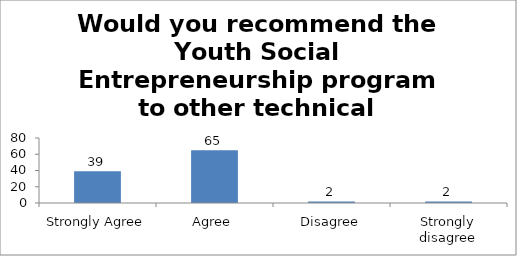
| Category | Would you recommend the Youth Social Entrepreneurship program to other technical institutions? |
|---|---|
| Strongly Agree | 39 |
| Agree | 65 |
| Disagree | 2 |
| Strongly disagree | 2 |